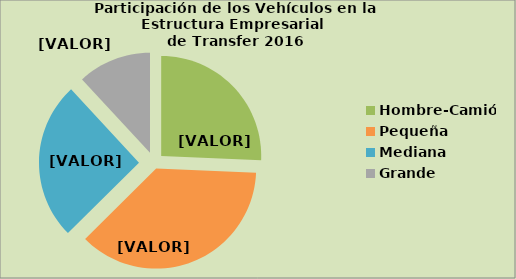
| Category | Series 0 |
|---|---|
| Hombre-Camión | 25.661 |
| Pequeña | 36.914 |
| Mediana | 25.537 |
| Grande | 11.887 |